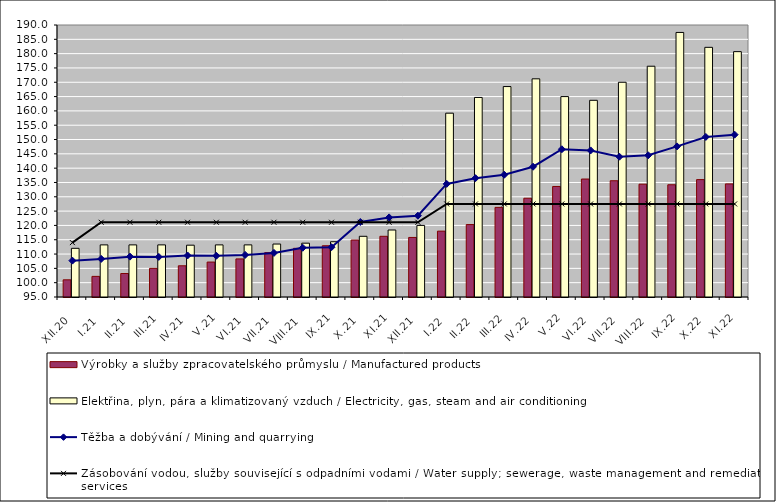
| Category | Výrobky a služby zpracovatelského průmyslu / Manufactured products | Elektřina, plyn, pára a klimatizovaný vzduch / Electricity, gas, steam and air conditioning |
|---|---|---|
| XII.20 | 101 | 112 |
| I.21 | 102.2 | 113.2 |
| II.21 | 103.2 | 113.2 |
| III.21 | 105 | 113.2 |
| IV.21 | 105.9 | 113.1 |
| V.21 | 107.2 | 113.2 |
| VI.21 | 108.3 | 113.2 |
| VII.21 | 110.5 | 113.5 |
| VIII.21 | 112 | 113.8 |
| IX.21 | 112.9 | 114.3 |
| X.21 | 114.9 | 116.2 |
| XI.21 | 116.2 | 118.4 |
| XII.21 | 115.8 | 120 |
| I.22 | 118 | 159.2 |
| II.22 | 120.3 | 164.7 |
| III.22 | 126.3 | 168.5 |
| IV.22 | 129.5 | 171.2 |
| V.22 | 133.6 | 165 |
| VI.22 | 136.2 | 163.7 |
| VII.22 | 135.6 | 170 |
| VIII.22 | 134.4 | 175.6 |
| IX.22 | 134.2 | 187.4 |
| X.22 | 136 | 182.2 |
| XI.22 | 134.5 | 180.7 |